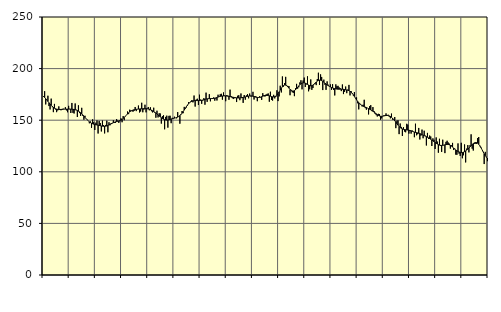
| Category | Piggar | Series 1 |
|---|---|---|
| nan | 172.6 | 173.1 |
| 87.0 | 178.1 | 172.04 |
| 87.0 | 165.3 | 170.77 |
| 87.0 | 169.5 | 169.47 |
| 87.0 | 173.7 | 168.21 |
| 87.0 | 163.7 | 166.92 |
| 87.0 | 160.4 | 165.65 |
| 87.0 | 170.9 | 164.44 |
| 87.0 | 162.6 | 163.34 |
| 87.0 | 157.8 | 162.39 |
| 87.0 | 165.8 | 161.63 |
| 87.0 | 160.4 | 161.09 |
| nan | 157.8 | 160.73 |
| 88.0 | 159.5 | 160.52 |
| 88.0 | 163.4 | 160.42 |
| 88.0 | 160.8 | 160.41 |
| 88.0 | 159.6 | 160.44 |
| 88.0 | 160 | 160.52 |
| 88.0 | 161.2 | 160.61 |
| 88.0 | 160.7 | 160.67 |
| 88.0 | 162.6 | 160.71 |
| 88.0 | 159.5 | 160.73 |
| 88.0 | 157.7 | 160.75 |
| 88.0 | 163.9 | 160.75 |
| nan | 161 | 160.73 |
| 89.0 | 157 | 160.7 |
| 89.0 | 166.7 | 160.64 |
| 89.0 | 157.1 | 160.53 |
| 89.0 | 156.5 | 160.37 |
| 89.0 | 166.2 | 160.14 |
| 89.0 | 160.1 | 159.8 |
| 89.0 | 153.1 | 159.35 |
| 89.0 | 164.4 | 158.76 |
| 89.0 | 156.9 | 158.05 |
| 89.0 | 154.2 | 157.2 |
| 89.0 | 162 | 156.2 |
| nan | 154.2 | 155.1 |
| 90.0 | 150.5 | 153.92 |
| 90.0 | 154.3 | 152.7 |
| 90.0 | 151.7 | 151.51 |
| 90.0 | 150.6 | 150.4 |
| 90.0 | 149.4 | 149.37 |
| 90.0 | 147 | 148.45 |
| 90.0 | 148.8 | 147.67 |
| 90.0 | 142.6 | 147.04 |
| 90.0 | 150.8 | 146.53 |
| 90.0 | 148.1 | 146.16 |
| 90.0 | 140.5 | 145.85 |
| nan | 147.6 | 145.59 |
| 91.0 | 149.8 | 145.37 |
| 91.0 | 137.1 | 145.15 |
| 91.0 | 149.4 | 144.92 |
| 91.0 | 147.3 | 144.67 |
| 91.0 | 139.1 | 144.43 |
| 91.0 | 149.6 | 144.24 |
| 91.0 | 145.3 | 144.13 |
| 91.0 | 137.2 | 144.13 |
| 91.0 | 145.4 | 144.23 |
| 91.0 | 149.5 | 144.46 |
| 91.0 | 138.3 | 144.83 |
| nan | 148 | 145.32 |
| 92.0 | 145.1 | 145.89 |
| 92.0 | 147.3 | 146.48 |
| 92.0 | 147.3 | 147.08 |
| 92.0 | 149.9 | 147.6 |
| 92.0 | 147.4 | 148.05 |
| 92.0 | 147.4 | 148.41 |
| 92.0 | 151.1 | 148.69 |
| 92.0 | 149.7 | 148.95 |
| 92.0 | 147.4 | 149.26 |
| 92.0 | 148.9 | 149.64 |
| 92.0 | 151.8 | 150.16 |
| nan | 148 | 150.88 |
| 93.0 | 154 | 151.75 |
| 93.0 | 150 | 152.76 |
| 93.0 | 153.6 | 153.87 |
| 93.0 | 155 | 155 |
| 93.0 | 158.4 | 156.1 |
| 93.0 | 155.9 | 157.15 |
| 93.0 | 160.2 | 158.05 |
| 93.0 | 159.5 | 158.78 |
| 93.0 | 159.2 | 159.36 |
| 93.0 | 158.2 | 159.8 |
| 93.0 | 159 | 160.11 |
| nan | 162.8 | 160.34 |
| 94.0 | 158.8 | 160.51 |
| 94.0 | 160.7 | 160.65 |
| 94.0 | 164.2 | 160.78 |
| 94.0 | 157.5 | 160.89 |
| 94.0 | 158.4 | 161 |
| 94.0 | 166.9 | 161.08 |
| 94.0 | 157.7 | 161.13 |
| 94.0 | 160.3 | 161.18 |
| 94.0 | 165 | 161.19 |
| 94.0 | 157.6 | 161.18 |
| 94.0 | 160.9 | 161.1 |
| nan | 162.8 | 160.91 |
| 95.0 | 159.6 | 160.62 |
| 95.0 | 162.5 | 160.23 |
| 95.0 | 158.7 | 159.7 |
| 95.0 | 157.5 | 159.11 |
| 95.0 | 162.1 | 158.47 |
| 95.0 | 157.2 | 157.72 |
| 95.0 | 152.4 | 156.89 |
| 95.0 | 159.2 | 156.03 |
| 95.0 | 152.7 | 155.09 |
| 95.0 | 156.7 | 154.15 |
| 95.0 | 156.5 | 153.25 |
| nan | 146.7 | 152.4 |
| 96.0 | 153.9 | 151.65 |
| 96.0 | 154.8 | 151.02 |
| 96.0 | 141.2 | 150.55 |
| 96.0 | 153.2 | 150.25 |
| 96.0 | 154.4 | 150.1 |
| 96.0 | 142.8 | 150.15 |
| 96.0 | 154.2 | 150.39 |
| 96.0 | 154.3 | 150.75 |
| 96.0 | 147.1 | 151.13 |
| 96.0 | 152.3 | 151.48 |
| 96.0 | 151.4 | 151.76 |
| nan | 153.4 | 152.01 |
| 97.0 | 152.3 | 152.27 |
| 97.0 | 151.8 | 152.59 |
| 97.0 | 157.9 | 153.02 |
| 97.0 | 153.6 | 153.65 |
| 97.0 | 146.6 | 154.47 |
| 97.0 | 155 | 155.51 |
| 97.0 | 158.9 | 156.79 |
| 97.0 | 156.8 | 158.25 |
| 97.0 | 162.9 | 159.86 |
| 97.0 | 161 | 161.55 |
| 97.0 | 162.4 | 163.22 |
| nan | 164.2 | 164.73 |
| 98.0 | 167.5 | 166.01 |
| 98.0 | 167.2 | 167.03 |
| 98.0 | 168.2 | 167.79 |
| 98.0 | 169.5 | 168.3 |
| 98.0 | 167.3 | 168.67 |
| 98.0 | 173.9 | 168.91 |
| 98.0 | 163.2 | 169.01 |
| 98.0 | 170 | 169.04 |
| 98.0 | 170.8 | 169.02 |
| 98.0 | 164.7 | 169 |
| 98.0 | 174.7 | 169.04 |
| nan | 170 | 169.16 |
| 99.0 | 165.9 | 169.33 |
| 99.0 | 169 | 169.57 |
| 99.0 | 171.4 | 169.85 |
| 99.0 | 165 | 170.16 |
| 99.0 | 176.7 | 170.44 |
| 99.0 | 167.8 | 170.66 |
| 99.0 | 170.6 | 170.82 |
| 99.0 | 175.2 | 170.91 |
| 99.0 | 168.3 | 170.97 |
| 99.0 | 171.3 | 170.99 |
| 99.0 | 171.5 | 171.02 |
| nan | 172.1 | 171.1 |
| 0.0 | 168.9 | 171.3 |
| 0.0 | 171 | 171.61 |
| 0.0 | 169.1 | 172 |
| 0.0 | 174.7 | 172.41 |
| 0.0 | 172.7 | 172.78 |
| 0.0 | 175.1 | 173.07 |
| 0.0 | 175.6 | 173.31 |
| 0.0 | 169.9 | 173.47 |
| 0.0 | 176.9 | 173.54 |
| 0.0 | 174 | 173.57 |
| 0.0 | 168.4 | 173.53 |
| nan | 174.3 | 173.41 |
| 1.0 | 173.8 | 173.26 |
| 1.0 | 169.8 | 173.07 |
| 1.0 | 179.6 | 172.84 |
| 1.0 | 173.4 | 172.63 |
| 1.0 | 171.4 | 172.4 |
| 1.0 | 170.5 | 172.19 |
| 1.0 | 171.3 | 171.98 |
| 1.0 | 172.2 | 171.79 |
| 1.0 | 167.6 | 171.65 |
| 1.0 | 173.7 | 171.55 |
| 1.0 | 174.2 | 171.54 |
| nan | 169.4 | 171.61 |
| 2.0 | 175.9 | 171.72 |
| 2.0 | 171.9 | 171.89 |
| 2.0 | 166.8 | 172.09 |
| 2.0 | 174.4 | 172.29 |
| 2.0 | 169.9 | 172.55 |
| 2.0 | 174.1 | 172.86 |
| 2.0 | 175.2 | 173.16 |
| 2.0 | 171.2 | 173.41 |
| 2.0 | 175.8 | 173.59 |
| 2.0 | 173 | 173.64 |
| 2.0 | 173 | 173.52 |
| nan | 177.5 | 173.26 |
| 3.0 | 170 | 172.91 |
| 3.0 | 173.4 | 172.53 |
| 3.0 | 172.8 | 172.2 |
| 3.0 | 168.4 | 172.04 |
| 3.0 | 172.4 | 172.02 |
| 3.0 | 173.1 | 172.15 |
| 3.0 | 172 | 172.43 |
| 3.0 | 169.7 | 172.8 |
| 3.0 | 176.2 | 173.22 |
| 3.0 | 174.3 | 173.62 |
| 3.0 | 172.9 | 173.9 |
| nan | 174.8 | 174.04 |
| 4.0 | 175.5 | 174.05 |
| 4.0 | 175.9 | 173.91 |
| 4.0 | 167.9 | 173.65 |
| 4.0 | 177.6 | 173.27 |
| 4.0 | 169.6 | 172.89 |
| 4.0 | 169 | 172.62 |
| 4.0 | 174.6 | 172.57 |
| 4.0 | 171.1 | 172.82 |
| 4.0 | 172.6 | 173.44 |
| 4.0 | 179 | 174.43 |
| 4.0 | 168.5 | 175.8 |
| nan | 173.1 | 177.45 |
| 5.0 | 183.4 | 179.22 |
| 5.0 | 176.9 | 180.94 |
| 5.0 | 192.4 | 182.45 |
| 5.0 | 182.5 | 183.54 |
| 5.0 | 186 | 184.06 |
| 5.0 | 192 | 183.97 |
| 5.0 | 183.8 | 183.36 |
| 5.0 | 183.2 | 182.33 |
| 5.0 | 183.1 | 181.08 |
| 5.0 | 174.2 | 179.86 |
| 5.0 | 179.4 | 178.89 |
| nan | 177.1 | 178.33 |
| 6.0 | 176.5 | 178.25 |
| 6.0 | 173.3 | 178.65 |
| 6.0 | 181 | 179.46 |
| 6.0 | 185.2 | 180.56 |
| 6.0 | 180.6 | 181.9 |
| 6.0 | 181.9 | 183.25 |
| 6.0 | 186.6 | 184.44 |
| 6.0 | 188.7 | 185.38 |
| 6.0 | 179.9 | 186 |
| 6.0 | 188.5 | 186.27 |
| 6.0 | 191.3 | 186.23 |
| nan | 182.2 | 185.89 |
| 7.0 | 184.7 | 185.33 |
| 7.0 | 192.5 | 184.69 |
| 7.0 | 178 | 184.07 |
| 7.0 | 180 | 183.57 |
| 7.0 | 189.5 | 183.35 |
| 7.0 | 179.4 | 183.5 |
| 7.0 | 181.2 | 184.01 |
| 7.0 | 185 | 184.85 |
| 7.0 | 185.2 | 185.89 |
| 7.0 | 184 | 186.97 |
| 7.0 | 189.9 | 187.89 |
| nan | 196 | 188.53 |
| 8.0 | 184.1 | 188.84 |
| 8.0 | 194.4 | 188.75 |
| 8.0 | 191.9 | 188.31 |
| 8.0 | 179.2 | 187.66 |
| 8.0 | 189.3 | 186.84 |
| 8.0 | 184.3 | 185.93 |
| 8.0 | 179.4 | 185.04 |
| 8.0 | 187.6 | 184.22 |
| 8.0 | 184.4 | 183.47 |
| 8.0 | 182.9 | 182.83 |
| 8.0 | 184.7 | 182.24 |
| nan | 179.4 | 181.71 |
| 9.0 | 184.9 | 181.25 |
| 9.0 | 179.3 | 180.87 |
| 9.0 | 174 | 180.55 |
| 9.0 | 184.7 | 180.32 |
| 9.0 | 182.9 | 180.18 |
| 9.0 | 183.3 | 180.09 |
| 9.0 | 181.8 | 180.06 |
| 9.0 | 181 | 180.07 |
| 9.0 | 178.2 | 180.06 |
| 9.0 | 184.6 | 180.01 |
| 9.0 | 175.3 | 179.9 |
| nan | 177.5 | 179.73 |
| 10.0 | 182.6 | 179.51 |
| 10.0 | 176.2 | 179.28 |
| 10.0 | 179.6 | 179.03 |
| 10.0 | 184.2 | 178.66 |
| 10.0 | 174 | 178.08 |
| 10.0 | 178.2 | 177.23 |
| 10.0 | 175.6 | 176.08 |
| 10.0 | 174 | 174.64 |
| 10.0 | 177.3 | 173.01 |
| 10.0 | 171.1 | 171.32 |
| 10.0 | 172.1 | 169.7 |
| nan | 166.4 | 168.24 |
| 11.0 | 160.5 | 166.96 |
| 11.0 | 165.5 | 165.88 |
| 11.0 | 165 | 164.99 |
| 11.0 | 163.4 | 164.24 |
| 11.0 | 165 | 163.61 |
| 11.0 | 169.8 | 163.12 |
| 11.0 | 161.7 | 162.69 |
| 11.0 | 160.2 | 162.27 |
| 11.0 | 161.8 | 161.8 |
| 11.0 | 155.6 | 161.24 |
| 11.0 | 163.6 | 160.65 |
| nan | 164.6 | 160.01 |
| 12.0 | 158.8 | 159.35 |
| 12.0 | 162.7 | 158.66 |
| 12.0 | 158.9 | 157.89 |
| 12.0 | 156.1 | 157.07 |
| 12.0 | 154.9 | 156.21 |
| 12.0 | 153.6 | 155.37 |
| 12.0 | 156.2 | 154.65 |
| 12.0 | 155.9 | 154.12 |
| 12.0 | 150.5 | 153.82 |
| 12.0 | 151.8 | 153.75 |
| 12.0 | 153.8 | 153.87 |
| nan | 154.7 | 154.09 |
| 13.0 | 154.8 | 154.36 |
| 13.0 | 156.6 | 154.54 |
| 13.0 | 154.4 | 154.6 |
| 13.0 | 155.3 | 154.48 |
| 13.0 | 153.3 | 154.16 |
| 13.0 | 151.8 | 153.63 |
| 13.0 | 156.4 | 152.87 |
| 13.0 | 150.6 | 151.9 |
| 13.0 | 150.4 | 150.77 |
| 13.0 | 153.1 | 149.49 |
| 13.0 | 142.3 | 148.09 |
| nan | 149.6 | 146.64 |
| 14.0 | 149.9 | 145.23 |
| 14.0 | 136.5 | 143.97 |
| 14.0 | 146.8 | 142.91 |
| 14.0 | 143.5 | 142.1 |
| 14.0 | 134.7 | 141.54 |
| 14.0 | 143.2 | 141.18 |
| 14.0 | 139 | 140.93 |
| 14.0 | 138.3 | 140.77 |
| 14.0 | 146.5 | 140.61 |
| 14.0 | 145.7 | 140.45 |
| 14.0 | 137 | 140.26 |
| nan | 139.8 | 140.02 |
| 15.0 | 137 | 139.69 |
| 15.0 | 140 | 139.3 |
| 15.0 | 138.7 | 138.89 |
| 15.0 | 133.5 | 138.52 |
| 15.0 | 146.6 | 138.21 |
| 15.0 | 135.4 | 137.97 |
| 15.0 | 136.4 | 137.71 |
| 15.0 | 142.5 | 137.41 |
| 15.0 | 131.3 | 137.05 |
| 15.0 | 135 | 136.6 |
| 15.0 | 140.9 | 136.09 |
| nan | 132.5 | 135.6 |
| 16.0 | 139.8 | 135.1 |
| 16.0 | 135 | 134.58 |
| 16.0 | 125.5 | 134.05 |
| 16.0 | 137.7 | 133.49 |
| 16.0 | 131.9 | 132.88 |
| 16.0 | 135.1 | 132.21 |
| 16.0 | 134.2 | 131.51 |
| 16.0 | 125 | 130.75 |
| 16.0 | 132.4 | 129.98 |
| 16.0 | 131 | 129.24 |
| 16.0 | 122.1 | 128.46 |
| nan | 133.3 | 127.66 |
| 17.0 | 129.3 | 126.91 |
| 17.0 | 118.5 | 126.28 |
| 17.0 | 132 | 125.84 |
| 17.0 | 125.1 | 125.61 |
| 17.0 | 119.3 | 125.53 |
| 17.0 | 131.1 | 125.61 |
| 17.0 | 126 | 125.82 |
| 17.0 | 118.1 | 126.13 |
| 17.0 | 129 | 126.42 |
| 17.0 | 130.1 | 126.56 |
| 17.0 | 128.4 | 126.52 |
| nan | 127.3 | 126.21 |
| 18.0 | 122.5 | 125.64 |
| 18.0 | 125.7 | 124.87 |
| 18.0 | 128 | 123.96 |
| 18.0 | 121.1 | 122.99 |
| 18.0 | 122.5 | 122.05 |
| 18.0 | 116.6 | 121.17 |
| 18.0 | 116.5 | 120.39 |
| 18.0 | 127.5 | 119.76 |
| 18.0 | 117.6 | 119.24 |
| 18.0 | 115.4 | 118.84 |
| 18.0 | 128.1 | 118.63 |
| nan | 113.1 | 118.66 |
| 19.0 | 116 | 118.96 |
| 19.0 | 126.5 | 119.51 |
| 19.0 | 109.1 | 120.22 |
| 19.0 | 122.5 | 121.03 |
| 19.0 | 125.9 | 121.98 |
| 19.0 | 118.8 | 123.03 |
| 19.0 | 125.8 | 124.16 |
| 19.0 | 136.3 | 125.3 |
| 19.0 | 122.4 | 126.39 |
| 19.0 | 120.6 | 127.36 |
| 19.0 | 127.1 | 128.05 |
| nan | 127.3 | 128.39 |
| 20.0 | 127.1 | 128.3 |
| 20.0 | 132.7 | 127.73 |
| 20.0 | 133.7 | 126.7 |
| 20.0 | 124.8 | 125.28 |
| 20.0 | 124.1 | 123.5 |
| 20.0 | 121.5 | 121.49 |
| 20.0 | 119.2 | 119.41 |
| 20.0 | 107.5 | 117.39 |
| 20.0 | 119.3 | 115.62 |
| 20.0 | 113.9 | 114.27 |
| 20.0 | 110.3 | 113.39 |